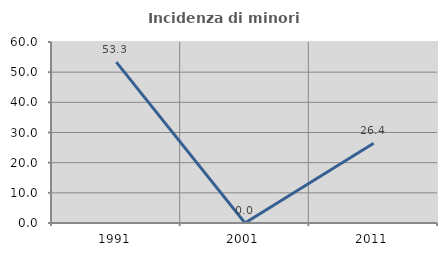
| Category | Incidenza di minori stranieri |
|---|---|
| 1991.0 | 53.333 |
| 2001.0 | 0 |
| 2011.0 | 26.429 |